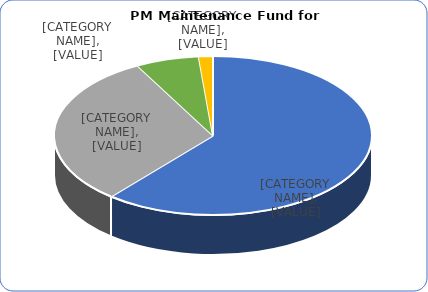
| Category | Series 0 |
|---|---|
| Total Sinks (incl 2023) | 157801.77 |
| Debits (excl Sink funds) | 80156.2 |
| Budget Remaining | 16680.8 |
| Remaining in acct | 3709.49 |